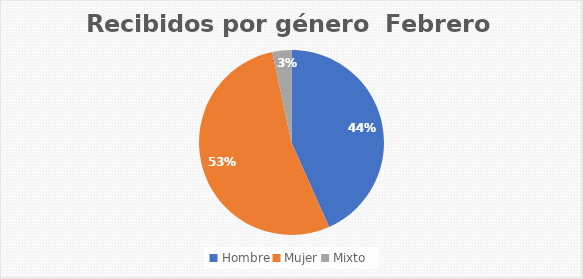
| Category | Recibidos por género  Febrero |
|---|---|
| Hombre | 13 |
| Mujer | 16 |
| Mixto | 1 |